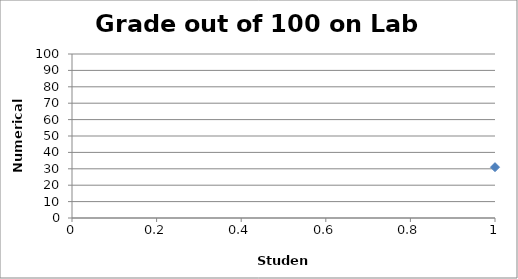
| Category | Series 0 |
|---|---|
| 0 | 31 |
| 1 | 45 |
| 2 | 49 |
| 3 | 51 |
| 4 | 51 |
| 5 | 53.5 |
| 6 | 57.5 |
| 7 | 60 |
| 8 | 61 |
| 9 | 62 |
| 10 | 62 |
| 11 | 68.5 |
| 12 | 71.5 |
| 13 | 72 |
| 14 | 73 |
| 15 | 75 |
| 16 | 78.5 |
| 17 | 79 |
| 18 | 79.5 |
| 19 | 80 |
| 20 | 81 |
| 21 | 81.5 |
| 22 | 83 |
| 23 | 84 |
| 24 | 87.5 |
| 25 | 89 |
| 26 | 92 |
| 27 | 94.5 |